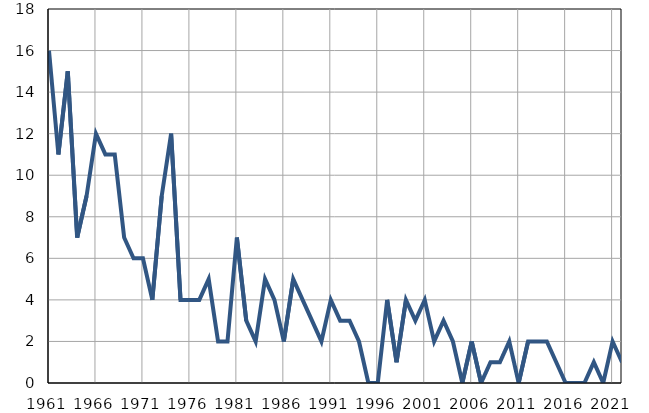
| Category | Умрла 
одојчад |
|---|---|
| 1961.0 | 16 |
| 1962.0 | 11 |
| 1963.0 | 15 |
| 1964.0 | 7 |
| 1965.0 | 9 |
| 1966.0 | 12 |
| 1967.0 | 11 |
| 1968.0 | 11 |
| 1969.0 | 7 |
| 1970.0 | 6 |
| 1971.0 | 6 |
| 1972.0 | 4 |
| 1973.0 | 9 |
| 1974.0 | 12 |
| 1975.0 | 4 |
| 1976.0 | 4 |
| 1977.0 | 4 |
| 1978.0 | 5 |
| 1979.0 | 2 |
| 1980.0 | 2 |
| 1981.0 | 7 |
| 1982.0 | 3 |
| 1983.0 | 2 |
| 1984.0 | 5 |
| 1985.0 | 4 |
| 1986.0 | 2 |
| 1987.0 | 5 |
| 1988.0 | 4 |
| 1989.0 | 3 |
| 1990.0 | 2 |
| 1991.0 | 4 |
| 1992.0 | 3 |
| 1993.0 | 3 |
| 1994.0 | 2 |
| 1995.0 | 0 |
| 1996.0 | 0 |
| 1997.0 | 4 |
| 1998.0 | 1 |
| 1999.0 | 4 |
| 2000.0 | 3 |
| 2001.0 | 4 |
| 2002.0 | 2 |
| 2003.0 | 3 |
| 2004.0 | 2 |
| 2005.0 | 0 |
| 2006.0 | 2 |
| 2007.0 | 0 |
| 2008.0 | 1 |
| 2009.0 | 1 |
| 2010.0 | 2 |
| 2011.0 | 0 |
| 2012.0 | 2 |
| 2013.0 | 2 |
| 2014.0 | 2 |
| 2015.0 | 1 |
| 2016.0 | 0 |
| 2017.0 | 0 |
| 2018.0 | 0 |
| 2019.0 | 1 |
| 2020.0 | 0 |
| 2021.0 | 2 |
| 2022.0 | 1 |